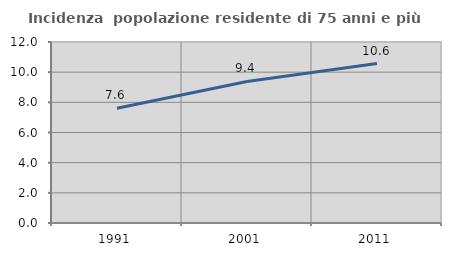
| Category | Incidenza  popolazione residente di 75 anni e più |
|---|---|
| 1991.0 | 7.606 |
| 2001.0 | 9.386 |
| 2011.0 | 10.573 |